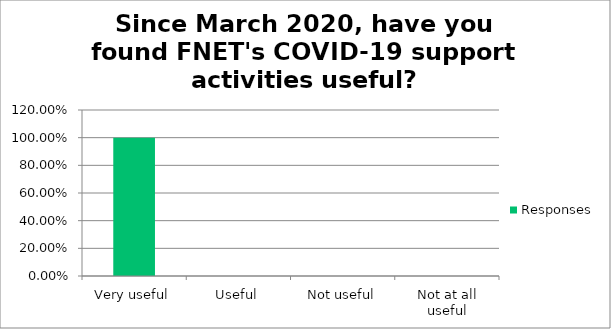
| Category | Responses |
|---|---|
| Very useful | 1 |
| Useful | 0 |
| Not useful | 0 |
| Not at all useful | 0 |